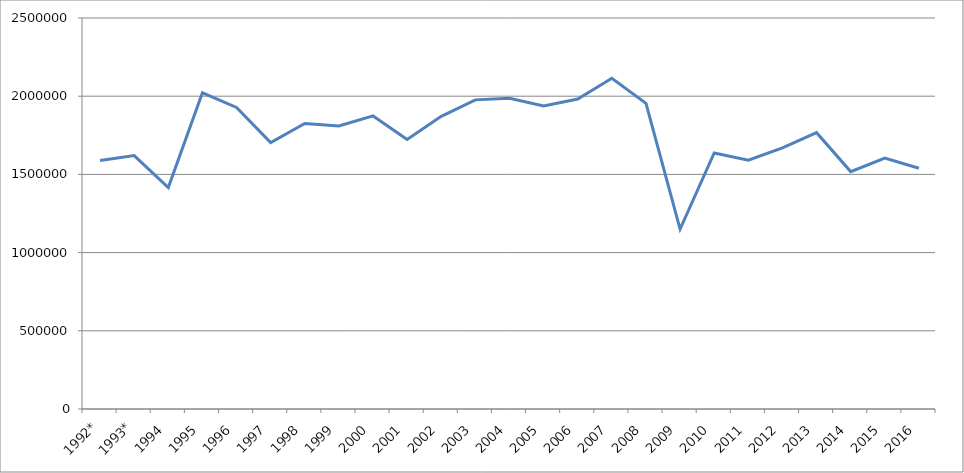
| Category | Series 0 |
|---|---|
| 1992* | 1589568 |
| 1993* | 1620402 |
| 1994 | 1415688 |
| 1995 | 2021334 |
| 1996 | 1928364 |
| 1997 | 1703840 |
| 1998 | 1825619 |
| 1999 | 1809066 |
| 2000 | 1873890 |
| 2001 | 1723000 |
| 2002 | 1871318.4 |
| 2003 | 1976517.4 |
| 2004 | 1987130.3 |
| 2005 | 1937703 |
| 2006 | 1981605.3 |
| 2007 | 2114815.37 |
| 2008 | 1954299.5 |
| 2009 | 1149915.6 |
| 2010 | 1636951 |
| 2011 | 1590627.04 |
| 2012 | 1669118.6 |
| 2013 | 1766984.101 |
| 2014 | 1517857.91 |
| 2015 | 1604777.4 |
| 2016 | 1539712.6 |